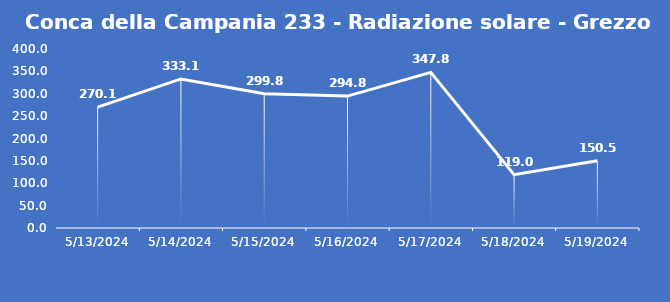
| Category | Conca della Campania 233 - Radiazione solare - Grezzo (W/m2) |
|---|---|
| 5/13/24 | 270.1 |
| 5/14/24 | 333.1 |
| 5/15/24 | 299.8 |
| 5/16/24 | 294.8 |
| 5/17/24 | 347.8 |
| 5/18/24 | 119 |
| 5/19/24 | 150.5 |